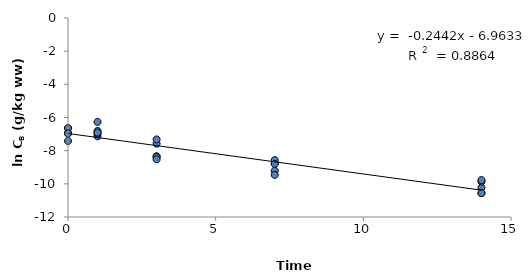
| Category | Series 0 |
|---|---|
| 0.0 | -7.419 |
| 0.0 | -6.645 |
| 0.0 | -6.645 |
| 0.0 | -6.938 |
| 0.0 | -6.97 |
| 1.0 | -7.131 |
| 1.0 | -6.97 |
| 1.0 | -6.266 |
| 1.0 | -6.812 |
| 1.0 | -6.908 |
| 3.0 | -7.581 |
| 3.0 | -7.323 |
| 3.0 | -8.335 |
| 3.0 | -8.377 |
| 3.0 | -8.517 |
| 7.0 | -8.74 |
| 7.0 | -8.568 |
| 7.0 | -8.805 |
| 7.0 | -9.21 |
| 7.0 | -9.459 |
| 14.0 | -10.232 |
| 14.0 | -10.557 |
| 14.0 | -10.557 |
| 14.0 | -9.864 |
| 14.0 | -9.772 |
| nan | 0 |
| nan | 0 |
| nan | 0 |
| nan | 0 |
| nan | 0 |
| nan | 0 |
| nan | 0 |
| nan | 0 |
| nan | 0 |
| nan | 0 |
| nan | 0 |
| nan | 0 |
| nan | 0 |
| nan | 0 |
| nan | 0 |
| nan | 0 |
| nan | 0 |
| nan | 0 |
| nan | 0 |
| nan | 0 |
| nan | 0 |
| nan | 0 |
| nan | 0 |
| nan | 0 |
| nan | 0 |
| nan | 0 |
| nan | 0 |
| nan | 0 |
| nan | 0 |
| nan | 0 |
| nan | 0 |
| nan | 0 |
| nan | 0 |
| nan | 0 |
| nan | 0 |
| nan | 0 |
| nan | 0 |
| nan | 0 |
| nan | 0 |
| nan | 0 |
| nan | 0 |
| nan | 0 |
| nan | 0 |
| nan | 0 |
| nan | 0 |